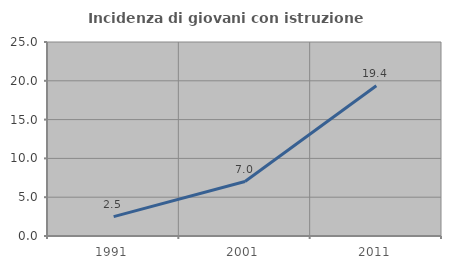
| Category | Incidenza di giovani con istruzione universitaria |
|---|---|
| 1991.0 | 2.5 |
| 2001.0 | 7.018 |
| 2011.0 | 19.355 |